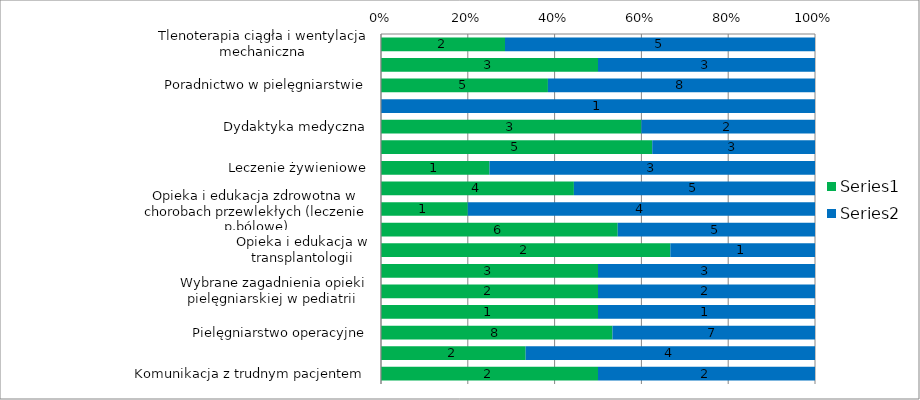
| Category | Series 0 | Series 1 |
|---|---|---|
| Tlenoterapia ciągła i wentylacja mechaniczna | 2 | 5 |
| Endoskopia | 3 | 3 |
| Poradnictwo w pielęgniarstwie | 5 | 8 |
| Język angielski | 0 | 1 |
| Dydaktyka medyczna | 3 | 2 |
| Koordynowana opieka zdrowotna | 5 | 3 |
| Leczenie żywieniowe | 1 | 3 |
| Promocja zdrowia i świadczenia profilaktycze | 4 | 5 |
| Opieka i edukacja zdrowotna w chorobach przewlekłych (leczenie p.bólowe) | 1 | 4 |
| Opieka i edukacja zdrowotna w zakresie ran przewlekłych i przetok | 6 | 5 |
| Opieka i edukacja w transplantologii | 2 | 1 |
| Badania naukowe w pielęgniarstwie  | 3 | 3 |
| Wybrane zagadnienia opieki pielęgniarskiej w pediatrii  | 2 | 2 |
| Zajęcia fakultatywne  | 1 | 1 |
| Pielęgniarstwo operacyjne | 8 | 7 |
| Podstawy seksuologii | 2 | 4 |
| Komunikacja z trudnym pacjentem  | 2 | 2 |